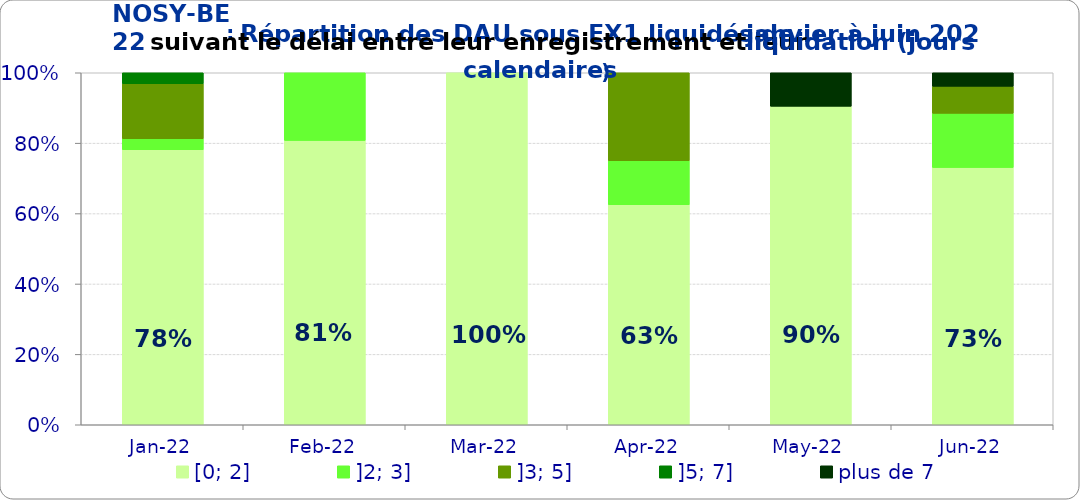
| Category | [0; 2] | ]2; 3] | ]3; 5] | ]5; 7] | plus de 7 |
|---|---|---|---|---|---|
| 2022-01-01 | 0.781 | 0.031 | 0.156 | 0.031 | 0 |
| 2022-02-01 | 0.808 | 0.192 | 0 | 0 | 0 |
| 2022-03-01 | 1 | 0 | 0 | 0 | 0 |
| 2022-04-01 | 0.625 | 0.125 | 0.25 | 0 | 0 |
| 2022-05-01 | 0.905 | 0 | 0 | 0 | 0.095 |
| 2022-06-01 | 0.731 | 0.154 | 0.077 | 0 | 0.038 |